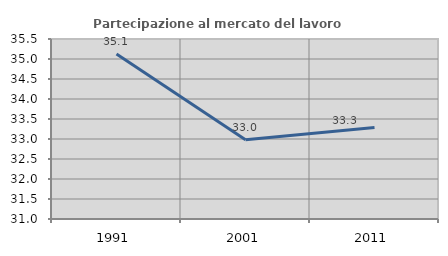
| Category | Partecipazione al mercato del lavoro  femminile |
|---|---|
| 1991.0 | 35.122 |
| 2001.0 | 32.983 |
| 2011.0 | 33.287 |